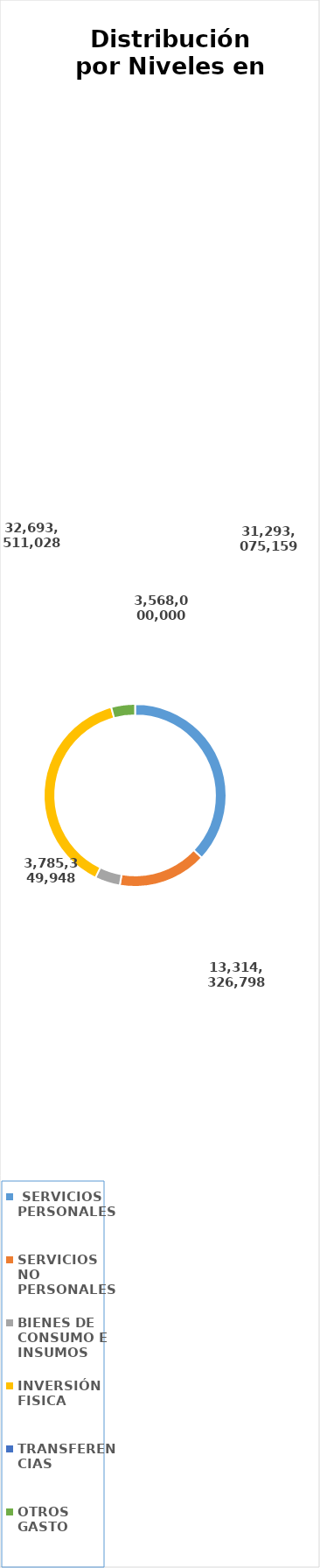
| Category | Series 0 | Series 1 |
|---|---|---|
|  SERVICIOS PERSONALES |  | 31293075159 |
| SERVICIOS NO PERSONALES |  | 13314326798 |
| BIENES DE CONSUMO E INSUMOS |  | 3785349948 |
| INVERSIÓN FISICA |  | 32693511028 |
| TRANSFERENCIAS |  | 0 |
| OTROS GASTO |  | 3568000000 |